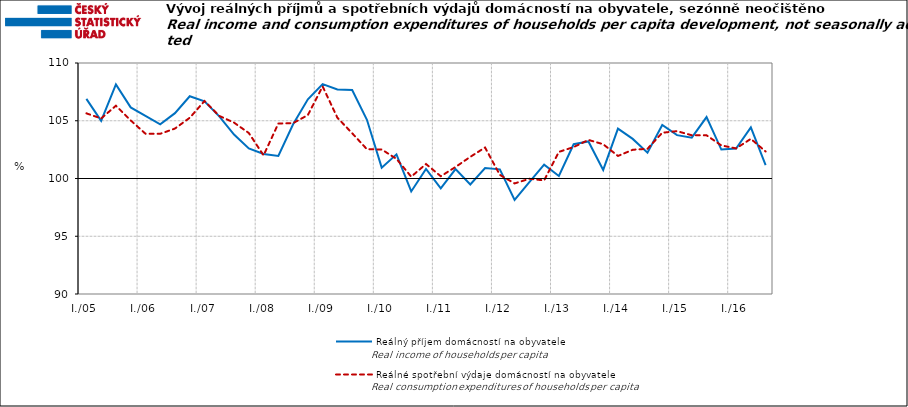
| Category | Reálný příjem domácností na obyvatele | Reálné spotřební výdaje domácností na obyvatele |
|---|---|---|
| I./05 | 106.898 | 105.642 |
|  | 104.998 | 105.199 |
|  | 108.15 | 106.3 |
|  | 106.155 | 105.031 |
| I./06 | 105.431 | 103.879 |
|  | 104.685 | 103.87 |
|  | 105.658 | 104.326 |
|  | 107.121 | 105.256 |
| I./07 | 106.684 | 106.711 |
|  | 105.383 | 105.42 |
|  | 103.807 | 104.837 |
|  | 102.598 | 103.939 |
| I./08 | 102.123 | 102.003 |
|  | 101.955 | 104.757 |
|  | 104.7 | 104.794 |
|  | 106.862 | 105.492 |
| I./09 | 108.173 | 107.97 |
|  | 107.713 | 105.261 |
|  | 107.657 | 103.919 |
|  | 105.084 | 102.535 |
| I./10 | 100.941 | 102.513 |
|  | 102.091 | 101.699 |
|  | 98.879 | 100.155 |
|  | 100.825 | 101.253 |
| I./11 | 99.141 | 100.195 |
|  | 100.817 | 100.995 |
|  | 99.488 | 101.876 |
|  | 100.901 | 102.682 |
| I./12 | 100.794 | 100.316 |
|  | 98.144 | 99.573 |
|  | 99.679 | 99.975 |
|  | 101.203 | 99.837 |
| I./13 | 100.22 | 102.304 |
|  | 102.967 | 102.721 |
|  | 103.21 | 103.342 |
|  | 100.746 | 102.966 |
| I./14 | 104.315 | 101.952 |
|  | 103.429 | 102.488 |
|  | 102.237 | 102.572 |
|  | 104.631 | 103.961 |
| I./15 | 103.755 | 104.1 |
|  | 103.538 | 103.744 |
|  | 105.317 | 103.739 |
|  | 102.506 | 102.864 |
| I./16 | 102.589 | 102.606 |